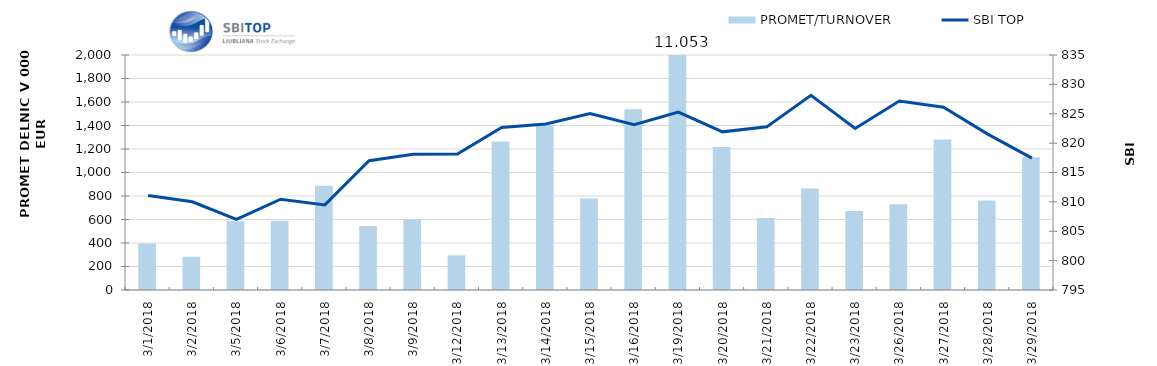
| Category | PROMET/TURNOVER |
|---|---|
| 3/1/18 | 395 |
| 3/2/18 | 283 |
| 3/5/18 | 585 |
| 3/6/18 | 589 |
| 3/7/18 | 888 |
| 3/8/18 | 545 |
| 3/9/18 | 601 |
| 3/12/18 | 295 |
| 3/13/18 | 1263 |
| 3/14/18 | 1405 |
| 3/15/18 | 779 |
| 3/16/18 | 1539 |
| 3/19/18 | 11053 |
| 3/20/18 | 1217 |
| 3/21/18 | 613 |
| 3/22/18 | 864 |
| 3/23/18 | 672 |
| 3/26/18 | 730 |
| 3/27/18 | 1280 |
| 3/28/18 | 762 |
| 3/29/18 | 1130 |